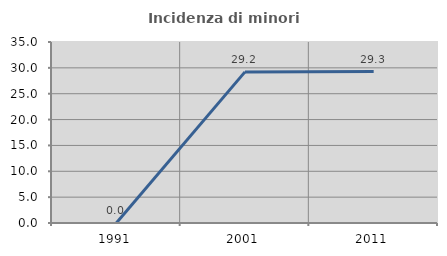
| Category | Incidenza di minori stranieri |
|---|---|
| 1991.0 | 0 |
| 2001.0 | 29.221 |
| 2011.0 | 29.288 |